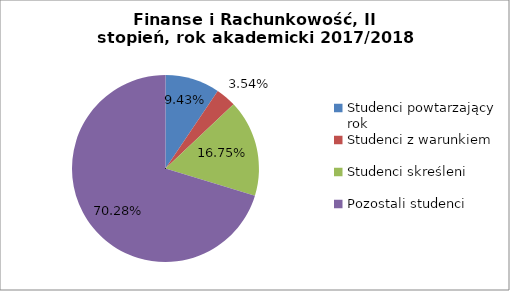
| Category | Series 0 |
|---|---|
| Studenci powtarzający rok | 40 |
| Studenci z warunkiem | 15 |
| Studenci skreśleni | 71 |
| Pozostali studenci | 298 |